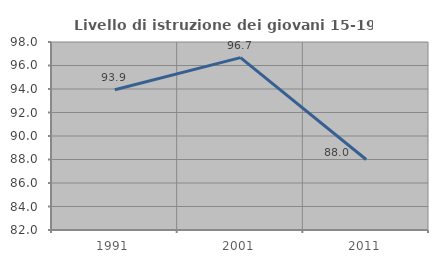
| Category | Livello di istruzione dei giovani 15-19 anni |
|---|---|
| 1991.0 | 93.939 |
| 2001.0 | 96.667 |
| 2011.0 | 88 |